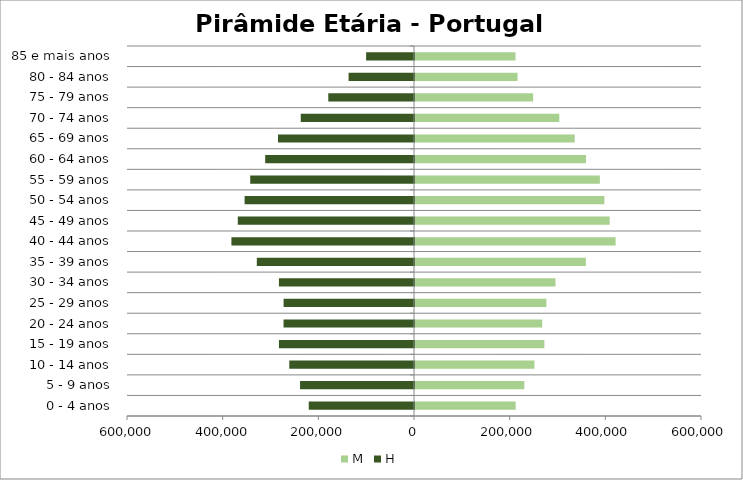
| Category | M | H |
|---|---|---|
| 0 - 4 anos | 210449 | -220012 |
| 5 - 9 anos | 228539 | -238215 |
| 10 - 14 anos | 249639 | -260712 |
| 15 - 19 anos | 270414 | -282330 |
| 20 - 24 anos | 265978 | -272727 |
| 25 - 29 anos | 274710 | -272620 |
| 30 - 34 anos | 293745 | -282370 |
| 35 - 39 anos | 357170 | -328594 |
| 40 - 44 anos | 419405 | -381711 |
| 45 - 49 anos | 406993 | -368384 |
| 50 - 54 anos | 395886 | -354097 |
| 55 - 59 anos | 386514 | -342424 |
| 60 - 64 anos | 357656 | -311098 |
| 65 - 69 anos | 333878 | -284295 |
| 70 - 74 anos | 301711 | -236729 |
| 75 - 79 anos | 246993 | -179163 |
| 80 - 84 anos | 214396 | -136786 |
| 85 e mais anos | 210175 | -100099 |